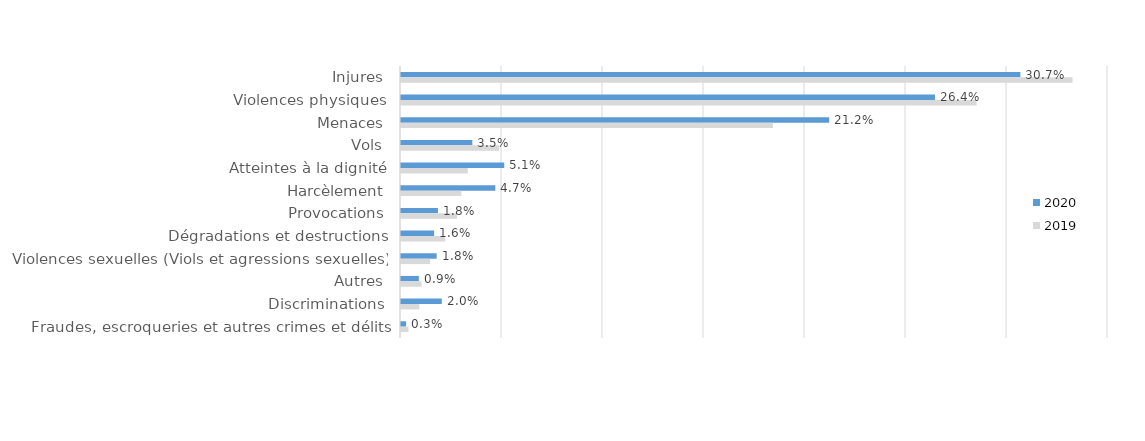
| Category | 2020 | 2019 |
|---|---|---|
| Injures | 0.307 | 0.332 |
| Violences physiques | 0.264 | 0.285 |
| Menaces | 0.212 | 0.184 |
| Vols | 0.035 | 0.049 |
| Atteintes à la dignité | 0.051 | 0.033 |
| Harcèlement | 0.047 | 0.03 |
| Provocations | 0.018 | 0.028 |
| Dégradations et destructions | 0.016 | 0.022 |
| Violences sexuelles (Viols et agressions sexuelles) | 0.018 | 0.014 |
| Autres | 0.009 | 0.01 |
| Discriminations | 0.02 | 0.009 |
| Fraudes, escroqueries et autres crimes et délits | 0.003 | 0.004 |